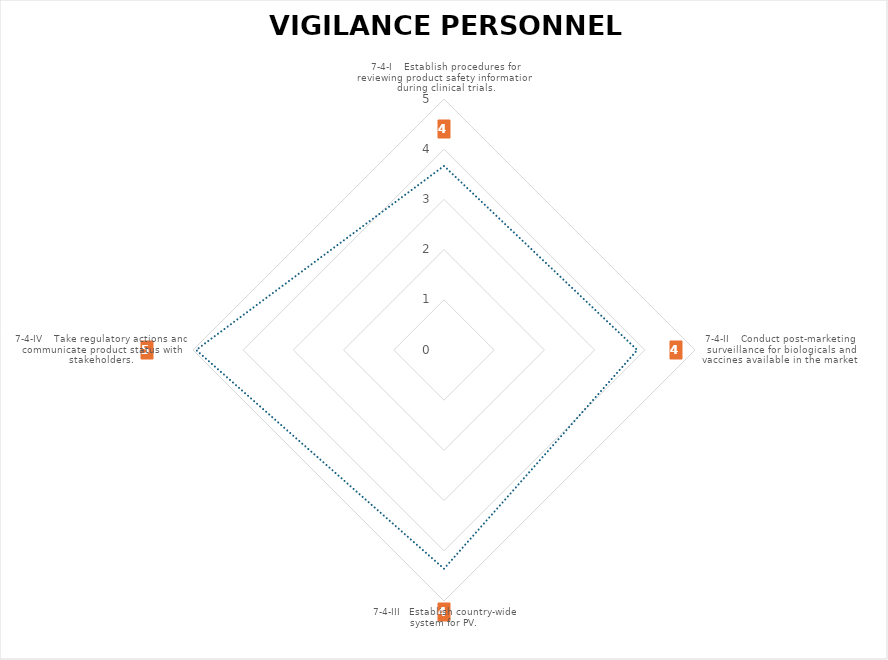
| Category | Average |
|---|---|
| 7-4-I    Establish procedures for reviewing product safety information during clinical trials. | 3.667 |
| 7-4-II    Conduct post-marketing surveillance for biologicals and vaccines available in the market. | 3.85 |
| 7-4-III   Establish country-wide system for PV. | 4.357 |
| 7-4-IV    Take regulatory actions and communicate product status with stakeholders. | 4.938 |